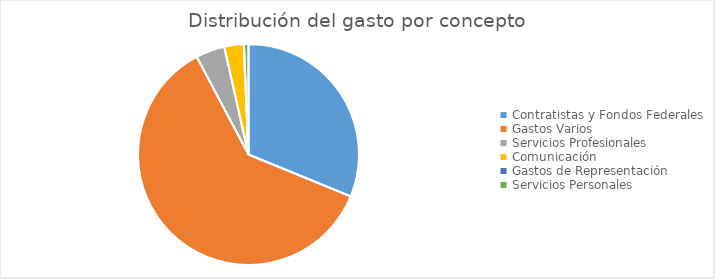
| Category | Series 0 |
|---|---|
| Contratistas y Fondos Federales | 238196505.33 |
| Gastos Varios | 466186044.26 |
| Servicios Profesionales | 32306334.27 |
| Comunicación | 21757552.4 |
| Gastos de Representación | 174069.01 |
| Servicios Personales | 5023734.95 |